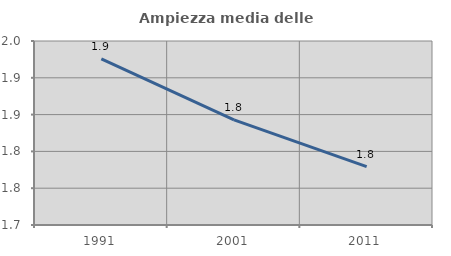
| Category | Ampiezza media delle famiglie |
|---|---|
| 1991.0 | 1.926 |
| 2001.0 | 1.843 |
| 2011.0 | 1.779 |